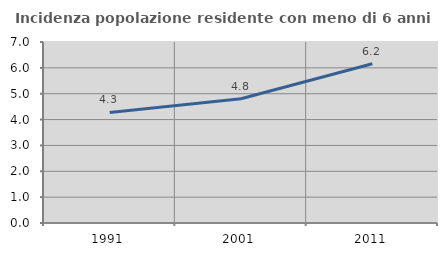
| Category | Incidenza popolazione residente con meno di 6 anni |
|---|---|
| 1991.0 | 4.278 |
| 2001.0 | 4.804 |
| 2011.0 | 6.161 |